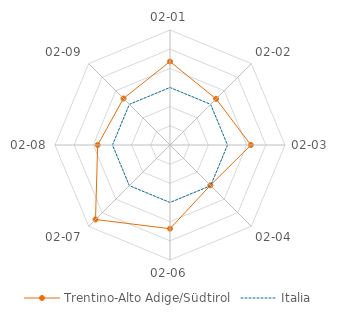
| Category | Trentino-Alto Adige/Südtirol | Italia |
|---|---|---|
| 02-01 | 1.354 | 0 |
| 02-02 | 0.399 | 0 |
| 02-03 | 1.221 | 0 |
| 02-04 | -0.024 | 0 |
| 02-06 | 1.368 | 0 |
| 02-07 | 2.495 | 0 |
| 02-08 | 0.774 | 0 |
| 02-09 | 0.433 | 0 |